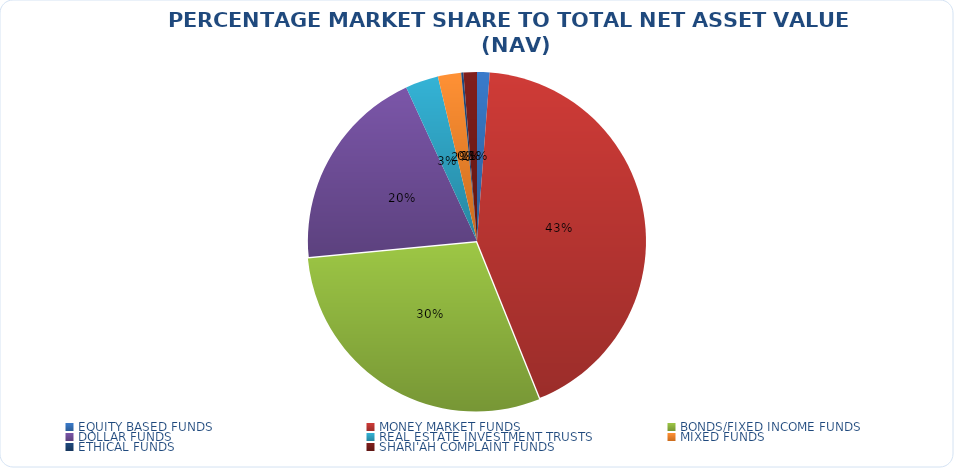
| Category | NET ASSET VALUE |
|---|---|
| EQUITY BASED FUNDS | 17306754395.8 |
| MONEY MARKET FUNDS | 612426859939.95 |
| BONDS/FIXED INCOME FUNDS | 423881337019.68 |
| DOLLAR FUNDS | 281621364672.795 |
| REAL ESTATE INVESTMENT TRUSTS | 45297921855.34 |
| MIXED FUNDS | 31876713315.17 |
| ETHICAL FUNDS | 3021121428.53 |
| SHARI'AH COMPLAINT FUNDS | 18431143418.31 |